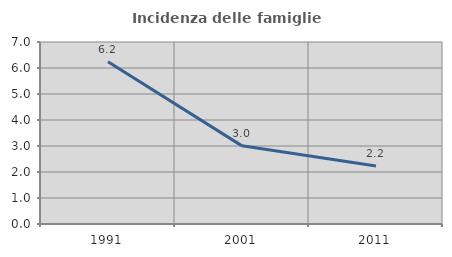
| Category | Incidenza delle famiglie numerose |
|---|---|
| 1991.0 | 6.241 |
| 2001.0 | 3.005 |
| 2011.0 | 2.233 |